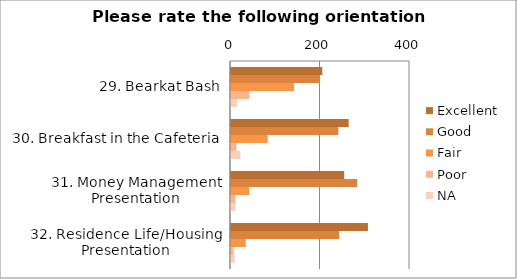
| Category | Excellent | Good | Fair | Poor | NA |
|---|---|---|---|---|---|
| 29. Bearkat Bash | 204 | 199 | 141 | 41 | 14 |
| 30. Breakfast in the Cafeteria | 263 | 240 | 82 | 12 | 21 |
| 31. Money Management Presentation | 253 | 282 | 41 | 10 | 10 |
| 32. Residence Life/Housing Presentation | 306 | 242 | 33 | 6 | 8 |